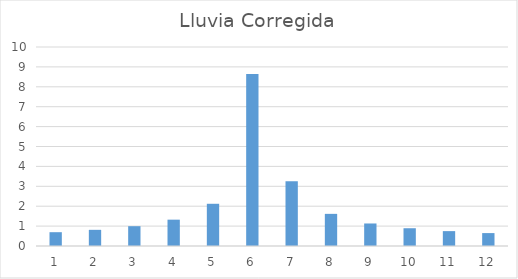
| Category | Lluvia Corregida |
|---|---|
| 0 | 0.694 |
| 1 | 0.812 |
| 2 | 0.995 |
| 3 | 1.323 |
| 4 | 2.122 |
| 5 | 8.637 |
| 6 | 3.254 |
| 7 | 1.615 |
| 8 | 1.132 |
| 9 | 0.893 |
| 10 | 0.748 |
| 11 | 0.649 |